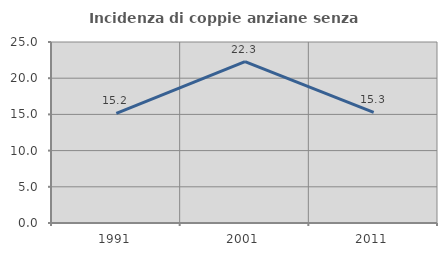
| Category | Incidenza di coppie anziane senza figli  |
|---|---|
| 1991.0 | 15.152 |
| 2001.0 | 22.302 |
| 2011.0 | 15.278 |